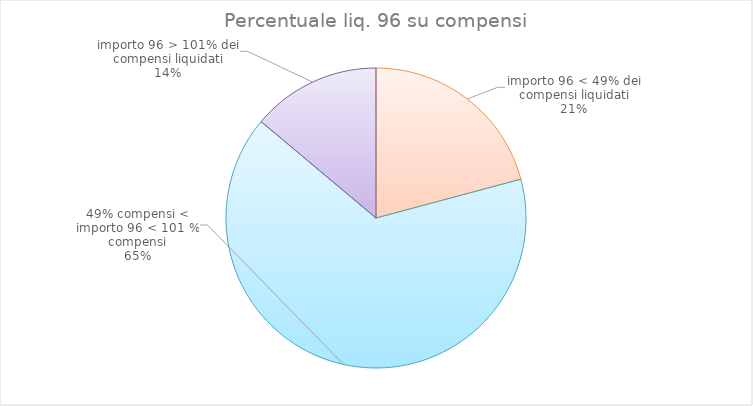
| Category | Series 0 | Series 1 |
|---|---|---|
| importo 96 < 49% dei compensi liquidati | 15 | 0.21 |
| 49% compensi < importo 96 < 101 % compensi | 47 | 0.65 |
| importo 96 > 101% dei compensi liquidati | 10 | 0.14 |